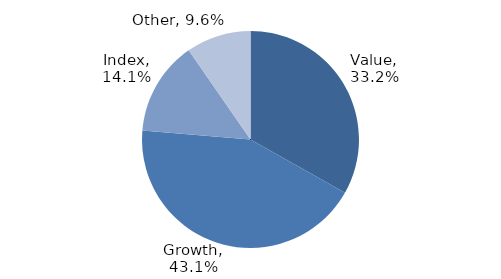
| Category | Investment Style |
|---|---|
| Value | 0.332 |
| Growth | 0.431 |
| Index | 0.141 |
| Other | 0.096 |